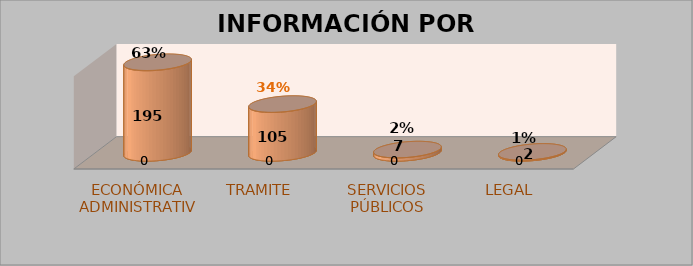
| Category | Series 0 | Series 1 | Series 2 | Series 3 |
|---|---|---|---|---|
| ECONÓMICA ADMINISTRATIVA |  |  | 195 | 0.631 |
| TRAMITE |  |  | 105 | 0.34 |
| SERVICIOS PÚBLICOS |  |  | 7 | 0.023 |
| LEGAL |  |  | 2 | 0.006 |